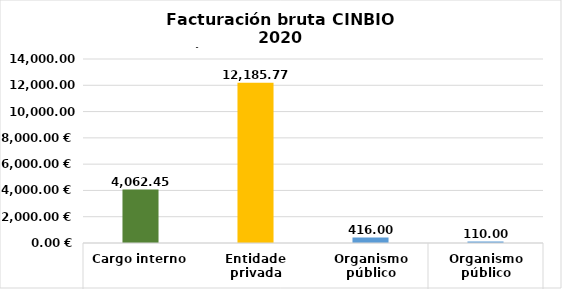
| Category | Series 0 |
|---|---|
| 0 | 4062.45 |
| 1 | 12185.769 |
| 2 | 416 |
| 3 | 110 |